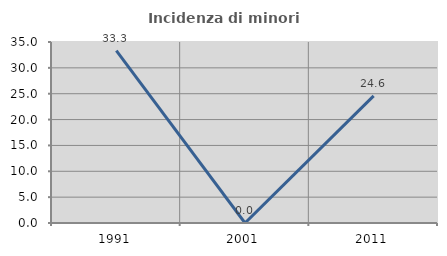
| Category | Incidenza di minori stranieri |
|---|---|
| 1991.0 | 33.333 |
| 2001.0 | 0 |
| 2011.0 | 24.59 |